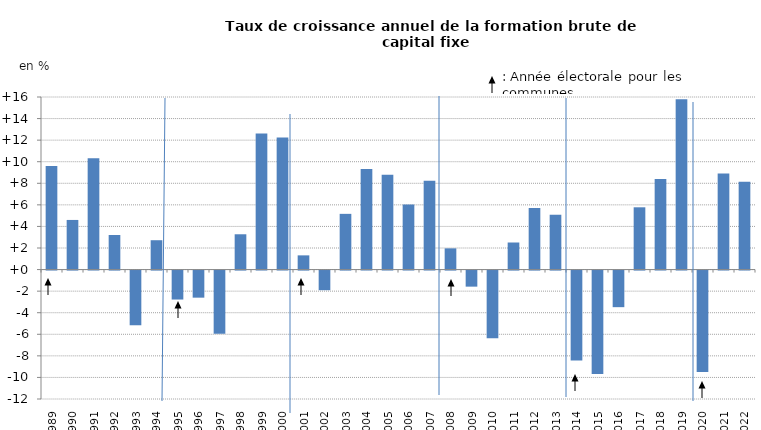
| Category | taux de croissance annuel de la FBCF des APUL |
|---|---|
| 1989.0 | 9.607 |
| 1990.0 | 4.601 |
| 1991.0 | 10.317 |
| 1992.0 | 3.205 |
| 1993.0 | -5.07 |
| 1994.0 | 2.722 |
| 1995.0 | -2.685 |
| 1996.0 | -2.511 |
| 1997.0 | -5.866 |
| 1998.0 | 3.273 |
| 1999.0 | 12.618 |
| 2000.0 | 12.235 |
| 2001.0 | 1.317 |
| 2002.0 | -1.82 |
| 2003.0 | 5.166 |
| 2004.0 | 9.33 |
| 2005.0 | 8.792 |
| 2006.0 | 6.025 |
| 2007.0 | 8.226 |
| 2008.0 | 1.967 |
| 2009.0 | -1.49 |
| 2010.0 | -6.267 |
| 2011.0 | 2.51 |
| 2012.0 | 5.707 |
| 2013.0 | 5.084 |
| 2014.0 | -8.328 |
| 2015.0 | -9.579 |
| 2016.0 | -3.393 |
| 2017.0 | 5.773 |
| 2018.0 | 8.396 |
| 2019.0 | 15.791 |
| 2020.0 | -9.408 |
| 2021.0 | 8.912 |
| 2022.0 | 8.143 |